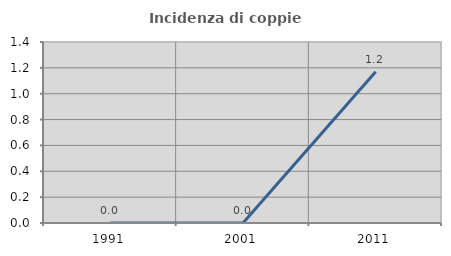
| Category | Incidenza di coppie miste |
|---|---|
| 1991.0 | 0 |
| 2001.0 | 0 |
| 2011.0 | 1.17 |